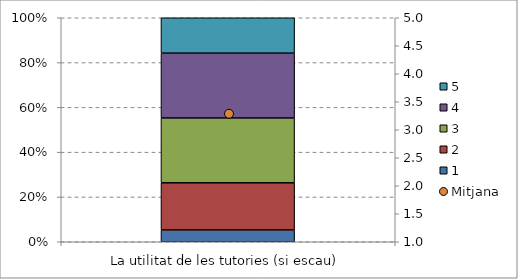
| Category | 1 | 2 | 3 | 4 | 5 |
|---|---|---|---|---|---|
| La utilitat de les tutories (si escau) | 2 | 8 | 11 | 11 | 6 |